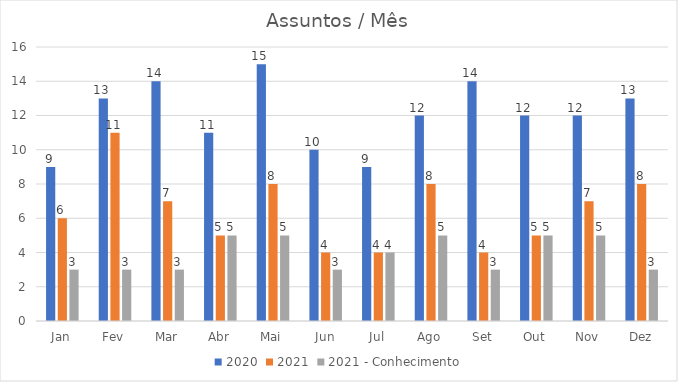
| Category | 2020 | 2021 | 2021 - Conhecimento |
|---|---|---|---|
| Jan | 9 | 6 | 3 |
| Fev | 13 | 11 | 3 |
| Mar | 14 | 7 | 3 |
| Abr | 11 | 5 | 5 |
| Mai | 15 | 8 | 5 |
| Jun | 10 | 4 | 3 |
| Jul | 9 | 4 | 4 |
| Ago | 12 | 8 | 5 |
| Set | 14 | 4 | 3 |
| Out | 12 | 5 | 5 |
| Nov | 12 | 7 | 5 |
| Dez | 13 | 8 | 3 |